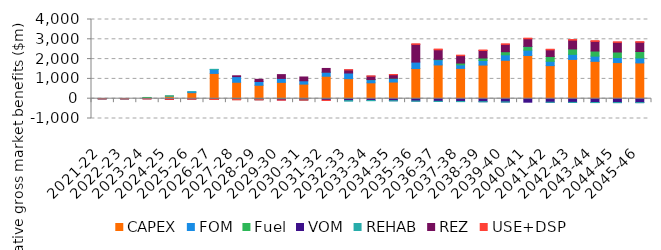
| Category | CAPEX | FOM | Fuel | VOM | REHAB | REZ | USE+DSP |
|---|---|---|---|---|---|---|---|
| 2021-22 | 0.004 | 0.001 | 2.083 | -0.014 | 0 | 0 | -0.001 |
| 2022-23 | -0.025 | -0.006 | 4.485 | -0.051 | 0 | -0.001 | -0.002 |
| 2023-24 | 45.175 | 11.57 | 5.767 | -0.25 | 0 | -0.001 | -0.002 |
| 2024-25 | 129.603 | -28.142 | 5.945 | -0.753 | 3.945 | -0.002 | -0.795 |
| 2025-26 | 305.729 | 42.087 | -4.542 | -1.712 | 1.607 | -0.002 | -11.5 |
| 2026-27 | 1277.311 | 198.015 | -14.529 | -12.107 | 7.525 | -0.001 | -13.442 |
| 2027-28 | 829.883 | 285.017 | -17.682 | -22.272 | -4.156 | 42.455 | -12.599 |
| 2028-29 | 679.651 | 187.668 | -14.2 | -33.137 | -3.531 | 111.019 | -9.618 |
| 2029-30 | 825.323 | 198.306 | -20.072 | -43.309 | 0.26 | 192.958 | -9.619 |
| 2030-31 | 736.725 | 168.378 | -7.518 | -55.011 | -0.003 | 191.642 | -8.222 |
| 2031-32 | 1135.374 | 199.676 | -8.105 | -67.973 | 1.405 | 191.334 | -12.374 |
| 2032-33 | 1011.12 | 286.589 | -17.222 | -79.877 | -23.863 | 154.233 | 11.739 |
| 2033-34 | 802.587 | 158.018 | 5.888 | -90.495 | -10.769 | 170.953 | 11.479 |
| 2034-35 | 842.047 | 171.437 | 19.805 | -100.313 | -10.943 | 176.869 | 10.742 |
| 2035-36 | 1523.172 | 326.601 | -0.375 | -115.752 | -10.943 | 893.369 | 28.207 |
| 2036-37 | 1705.99 | 258.337 | 23.295 | -130.802 | -9.011 | 482.412 | 35.877 |
| 2037-38 | 1531.424 | 179.214 | 89.604 | -139.196 | -9.011 | 375.395 | 23.081 |
| 2038-39 | 1698.919 | 229.184 | 127.617 | -149.316 | -9.011 | 379.701 | 23.31 |
| 2039-40 | 1938.09 | 278.647 | 156.487 | -161.474 | -9.011 | 368.743 | 27.525 |
| 2040-41 | 2183.559 | 270.196 | 175.104 | -176.067 | 13.687 | 384.337 | 30.03 |
| 2041-42 | 1669.865 | 220.357 | 243.425 | -178.307 | -3.029 | 334.628 | 29.094 |
| 2042-43 | 1983.773 | 256.151 | 273.999 | -185.96 | -3.029 | 444.315 | 28.686 |
| 2043-44 | 1886.825 | 263.181 | 257.97 | -193.297 | -3.029 | 486.021 | 36.358 |
| 2044-45 | 1824.65 | 255.729 | 277.796 | -195.088 | -3.029 | 486.314 | 26.84 |
| 2045-46 | 1807.26 | 250.15 | 326.826 | -196.539 | -3.029 | 466.101 | 29.108 |